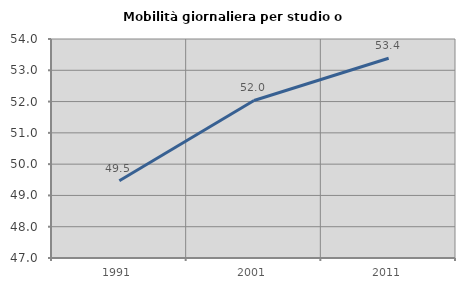
| Category | Mobilità giornaliera per studio o lavoro |
|---|---|
| 1991.0 | 49.467 |
| 2001.0 | 52.035 |
| 2011.0 | 53.386 |